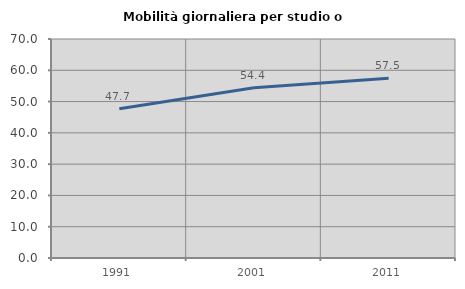
| Category | Mobilità giornaliera per studio o lavoro |
|---|---|
| 1991.0 | 47.722 |
| 2001.0 | 54.4 |
| 2011.0 | 57.456 |